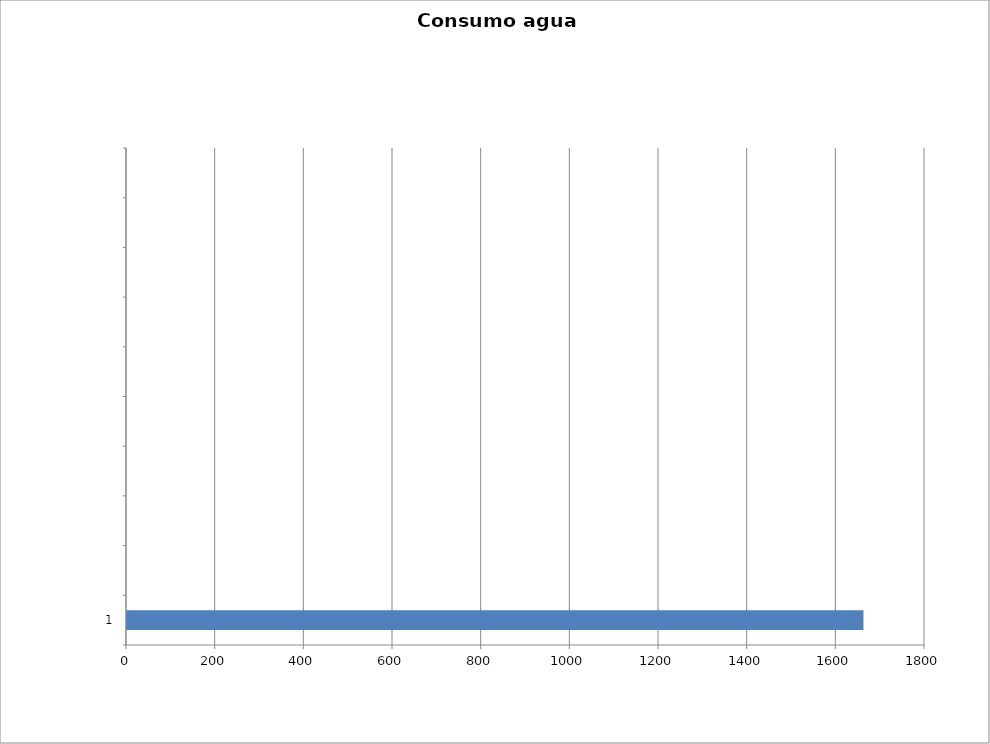
| Category | Series 0 |
|---|---|
| 1 | 1661.167 |